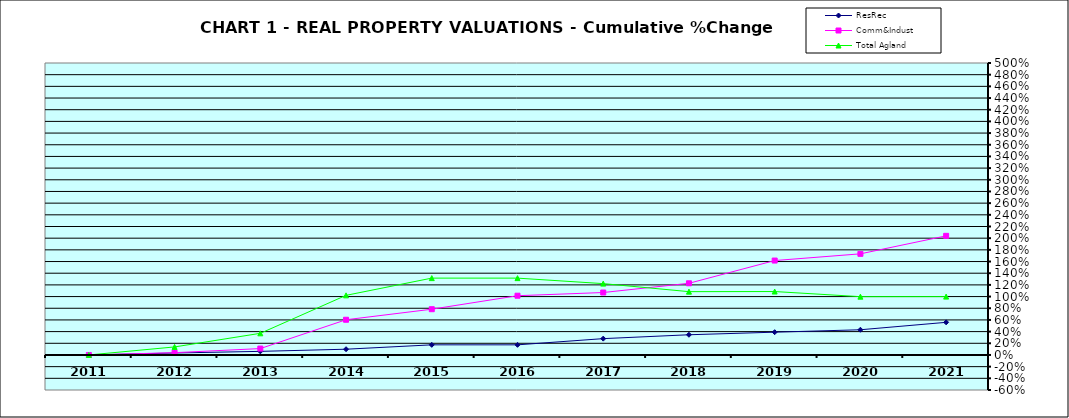
| Category | ResRec | Comm&Indust | Total Agland |
|---|---|---|---|
| 2011.0 | 0 | 0 | 0 |
| 2012.0 | 0.034 | 0.039 | 0.138 |
| 2013.0 | 0.062 | 0.11 | 0.371 |
| 2014.0 | 0.099 | 0.603 | 1.021 |
| 2015.0 | 0.173 | 0.784 | 1.316 |
| 2016.0 | 0.173 | 1.015 | 1.316 |
| 2017.0 | 0.28 | 1.069 | 1.222 |
| 2018.0 | 0.346 | 1.227 | 1.084 |
| 2019.0 | 0.39 | 1.617 | 1.086 |
| 2020.0 | 0.432 | 1.732 | 0.999 |
| 2021.0 | 0.559 | 2.04 | 0.999 |